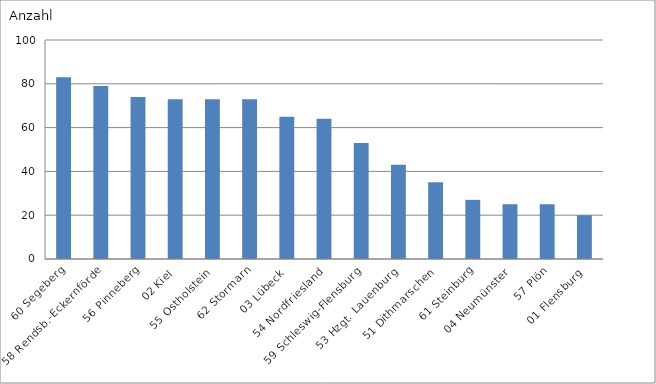
| Category | 60 Segeberg |
|---|---|
| 60 Segeberg | 83 |
| 58 Rendsb.-Eckernförde | 79 |
| 56 Pinneberg | 74 |
| 02 Kiel | 73 |
| 55 Ostholstein | 73 |
| 62 Stormarn | 73 |
| 03 Lübeck | 65 |
| 54 Nordfriesland | 64 |
| 59 Schleswig-Flensburg | 53 |
| 53 Hzgt. Lauenburg | 43 |
| 51 Dithmarschen | 35 |
| 61 Steinburg | 27 |
| 04 Neumünster | 25 |
| 57 Plön | 25 |
| 01 Flensburg | 20 |